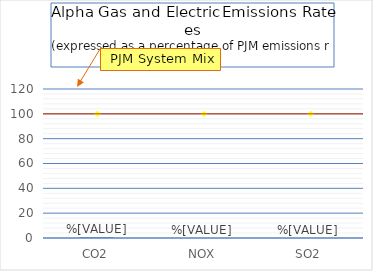
| Category | % of PJM Emissions |
|---|---|
| CO2 | 0.568 |
| NOX | 0 |
| SO2 | 0 |